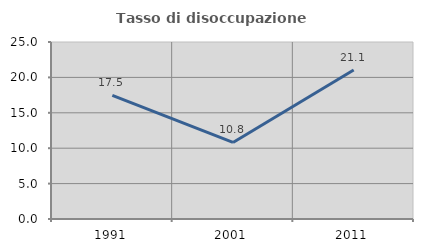
| Category | Tasso di disoccupazione giovanile  |
|---|---|
| 1991.0 | 17.46 |
| 2001.0 | 10.811 |
| 2011.0 | 21.053 |